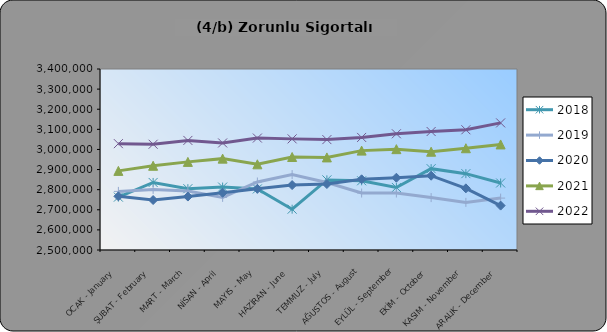
| Category | 2018 | 2019 | 2020 | 2021 | 2022 |
|---|---|---|---|---|---|
| OCAK - January | 2762901 | 2791418 | 2766914 | 2893394 | 3028857 |
| ŞUBAT - February | 2835795 | 2801378 | 2748447 | 2918795 | 3025847 |
| MART - March | 2804909 | 2793511 | 2765787 | 2938150 | 3044857 |
| NİSAN - April | 2812961 | 2761695 | 2784393 | 2954314 | 3032348 |
| MAYIS - May | 2803693 | 2838167 | 2804352 | 2926067 | 3056661 |
| HAZİRAN - June | 2702964 | 2874942 | 2822772 | 2962449 | 3052556 |
| TEMMUZ - July | 2848614 | 2835662 | 2828024 | 2960383 | 3048929 |
| AĞUSTOS - August | 2844133 | 2783315 | 2851542 | 2994151 | 3059726 |
| EYLÜL - September | 2810852 | 2783328 | 2859258 | 3001496 | 3077856 |
| EKİM - October | 2904436 | 2760621 | 2869425 | 2988675 | 3089080 |
| KASIM - November | 2879630 | 2736801 | 2806449 | 3005949 | 3097926 |
| ARALIK - December | 2833299 | 2758067 | 2720780 | 3024877 | 3131996 |